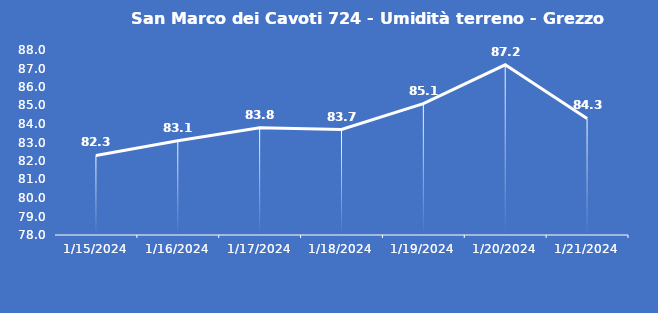
| Category | San Marco dei Cavoti 724 - Umidità terreno - Grezzo (%VWC) |
|---|---|
| 1/15/24 | 82.3 |
| 1/16/24 | 83.1 |
| 1/17/24 | 83.8 |
| 1/18/24 | 83.7 |
| 1/19/24 | 85.1 |
| 1/20/24 | 87.2 |
| 1/21/24 | 84.3 |